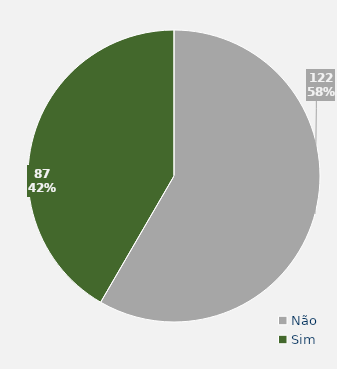
| Category | Total |
|---|---|
| Não | 122 |
| Sim | 87 |